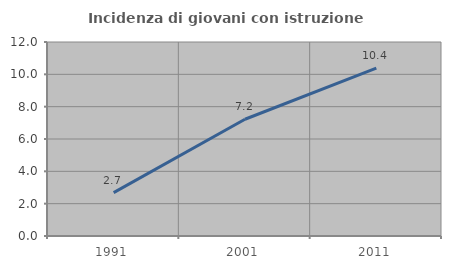
| Category | Incidenza di giovani con istruzione universitaria |
|---|---|
| 1991.0 | 2.685 |
| 2001.0 | 7.222 |
| 2011.0 | 10.39 |